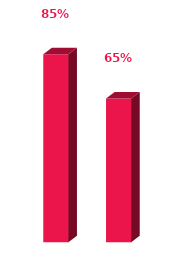
| Category | Series 0 |
|---|---|
| 0 | 0.85 |
| 1 | 0.65 |